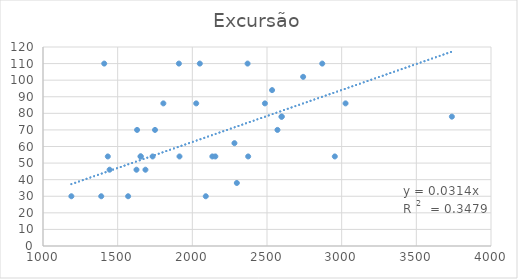
| Category | Excursão |
|---|---|
| 2870.0 | 110 |
| 1570.0 | 30 |
| 2374.0 | 54 |
| 2026.0 | 86 |
| 1410.0 | 110 |
| 2598.0 | 78 |
| 2370.0 | 110 |
| 1910.0 | 110 |
| 3738.0 | 78 |
| 2570.0 | 70 |
| 1654.0 | 54 |
| 1630.0 | 70 |
| 1626.0 | 46 |
| 1390.0 | 30 |
| 2298.0 | 38 |
| 1190.0 | 30 |
| 2742.0 | 102 |
| 2486.0 | 86 |
| 1446.0 | 46 |
| 2534.0 | 94 |
| 2090.0 | 30 |
| 1806.0 | 86 |
| 1654.0 | 54 |
| 2050.0 | 110 |
| 2134.0 | 54 |
| 1434.0 | 54 |
| 1914.0 | 54 |
| 1734.0 | 54 |
| 2282.0 | 62 |
| 2954.0 | 54 |
| 1686.0 | 46 |
| 2598.0 | 78 |
| 1750.0 | 70 |
| 3026.0 | 86 |
| 2154.0 | 54 |